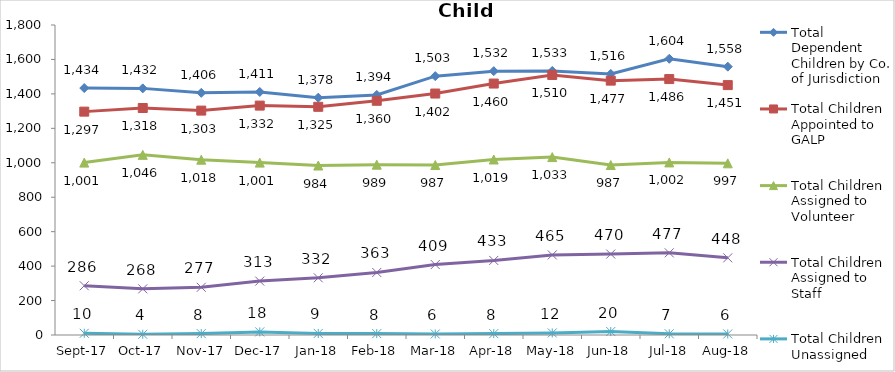
| Category | Total Dependent Children by Co. of Jurisdiction | Total Children Appointed to GALP | Total Children Assigned to Volunteer | Total Children Assigned to Staff | Total Children Unassigned |
|---|---|---|---|---|---|
| 2017-09-01 | 1434 | 1297 | 1001 | 286 | 10 |
| 2017-10-01 | 1432 | 1318 | 1046 | 268 | 4 |
| 2017-11-01 | 1406 | 1303 | 1018 | 277 | 8 |
| 2017-12-01 | 1411 | 1332 | 1001 | 313 | 18 |
| 2018-01-01 | 1378 | 1325 | 984 | 332 | 9 |
| 2018-02-01 | 1394 | 1360 | 989 | 363 | 8 |
| 2018-03-01 | 1503 | 1402 | 987 | 409 | 6 |
| 2018-04-01 | 1532 | 1460 | 1019 | 433 | 8 |
| 2018-05-01 | 1533 | 1510 | 1033 | 465 | 12 |
| 2018-06-01 | 1516 | 1477 | 987 | 470 | 20 |
| 2018-07-01 | 1604 | 1486 | 1002 | 477 | 7 |
| 2018-08-01 | 1558 | 1451 | 997 | 448 | 6 |